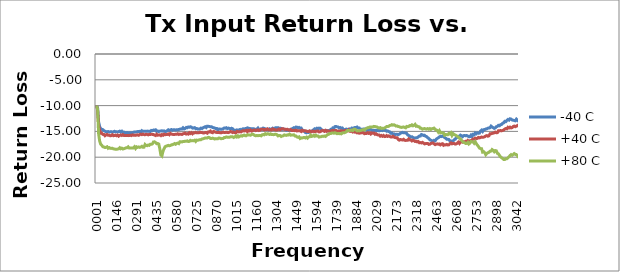
| Category | -40 C | +40 C | +80 C |
|---|---|---|---|
| 1000000.0 | -10 | -10 | -10 |
| 8622500.0 | -10.406 | -10.867 | -10.661 |
| 16245000.0 | -13.164 | -13.884 | -15.532 |
| 23867500.0 | -14.126 | -14.78 | -16.894 |
| 31490000.0 | -14.469 | -15.348 | -17.511 |
| 39112500.0 | -14.605 | -15.348 | -17.685 |
| 46735000.0 | -14.668 | -15.577 | -17.967 |
| 54357500.0 | -14.865 | -15.582 | -18.017 |
| 61980000.0 | -14.966 | -15.832 | -18.123 |
| 69602500.0 | -15.059 | -15.669 | -18.087 |
| 77225000.0 | -15.07 | -15.591 | -17.977 |
| 84847500.0 | -15.022 | -15.752 | -18.266 |
| 92470000.0 | -15.108 | -15.729 | -18.141 |
| 100092500.0 | -15.092 | -15.85 | -18.28 |
| 107715000.0 | -15.068 | -15.817 | -18.296 |
| 115337500.0 | -15.127 | -15.643 | -18.258 |
| 122960000.0 | -15.093 | -15.827 | -18.385 |
| 130582500.0 | -14.984 | -15.808 | -18.409 |
| 138205000.0 | -15.082 | -15.721 | -18.461 |
| 145827500.0 | -15.086 | -15.832 | -18.457 |
| 153450000.0 | -15.106 | -15.706 | -18.428 |
| 161072500.0 | -15.042 | -15.921 | -18.37 |
| 168695000.0 | -14.95 | -15.761 | -18.169 |
| 176317500.0 | -15.136 | -15.681 | -18.36 |
| 183940000.0 | -14.973 | -15.785 | -18.251 |
| 191562500.0 | -15.238 | -15.634 | -18.404 |
| 199185000.0 | -15.139 | -15.783 | -18.338 |
| 206807500.0 | -15.247 | -15.796 | -18.275 |
| 214430000.0 | -15.261 | -15.783 | -18.187 |
| 222052500.0 | -15.218 | -15.792 | -18.161 |
| 229675000.0 | -15.338 | -15.82 | -17.993 |
| 237297500.0 | -15.252 | -15.797 | -18.234 |
| 244920000.0 | -15.248 | -15.747 | -18.239 |
| 252542500.0 | -15.294 | -15.813 | -18.208 |
| 260165000.0 | -15.252 | -15.669 | -18.198 |
| 267787500.0 | -15.179 | -15.744 | -18.199 |
| 275410000.0 | -15.116 | -15.716 | -17.983 |
| 283032500.0 | -15.129 | -15.763 | -18.3 |
| 290655000.0 | -15.085 | -15.687 | -17.994 |
| 298277500.0 | -15.026 | -15.668 | -18.102 |
| 305900000.0 | -15.038 | -15.749 | -18.011 |
| 313522500.0 | -14.986 | -15.612 | -18.091 |
| 321145000.0 | -15.188 | -15.537 | -18.026 |
| 328767500.0 | -14.872 | -15.624 | -17.884 |
| 336390000.0 | -14.987 | -15.521 | -18.079 |
| 344012500.0 | -14.959 | -15.625 | -18.056 |
| 351635000.0 | -14.995 | -15.633 | -17.539 |
| 359257500.0 | -14.993 | -15.559 | -17.719 |
| 366880000.0 | -14.943 | -15.601 | -17.771 |
| 374502500.0 | -14.981 | -15.676 | -17.636 |
| 382125000.0 | -14.96 | -15.57 | -17.703 |
| 389747500.0 | -15.027 | -15.598 | -17.497 |
| 397370000.0 | -14.813 | -15.552 | -17.51 |
| 404992500.0 | -14.86 | -15.59 | -17.403 |
| 412615000.0 | -14.733 | -15.609 | -17.042 |
| 420237500.0 | -14.773 | -15.721 | -17.022 |
| 427860000.0 | -14.693 | -15.799 | -17.17 |
| 435482500.0 | -15.021 | -15.562 | -17.385 |
| 443105000.0 | -14.916 | -15.735 | -17.334 |
| 450727500.0 | -15.025 | -15.702 | -17.452 |
| 458350000.0 | -14.945 | -15.663 | -18.364 |
| 465972500.0 | -14.92 | -15.805 | -19.572 |
| 473595000.0 | -14.875 | -15.612 | -19.762 |
| 481217500.0 | -14.97 | -15.741 | -18.847 |
| 488840000.0 | -14.903 | -15.534 | -18.354 |
| 496462500.0 | -15.027 | -15.64 | -17.966 |
| 504085000.0 | -14.991 | -15.608 | -17.851 |
| 511707500.0 | -14.853 | -15.604 | -17.8 |
| 519330000.0 | -14.692 | -15.499 | -17.709 |
| 526952500.0 | -14.823 | -15.648 | -17.79 |
| 534575000.0 | -14.728 | -15.394 | -17.733 |
| 542197500.0 | -14.643 | -15.502 | -17.607 |
| 549820000.0 | -14.768 | -15.571 | -17.584 |
| 557442500.0 | -14.67 | -15.622 | -17.469 |
| 565065000.0 | -14.696 | -15.581 | -17.358 |
| 572687500.0 | -14.714 | -15.565 | -17.492 |
| 580310000.0 | -14.693 | -15.555 | -17.335 |
| 587932500.0 | -14.677 | -15.461 | -17.275 |
| 595555000.0 | -14.633 | -15.596 | -17.369 |
| 603177500.0 | -14.568 | -15.521 | -17.01 |
| 610800000.0 | -14.519 | -15.541 | -17.002 |
| 618422500.0 | -14.523 | -15.586 | -17.042 |
| 626045000.0 | -14.307 | -15.459 | -16.971 |
| 633667500.0 | -14.518 | -15.417 | -16.959 |
| 641290000.0 | -14.435 | -15.334 | -16.894 |
| 648912500.0 | -14.233 | -15.518 | -16.909 |
| 656535000.0 | -14.299 | -15.438 | -16.837 |
| 664157500.0 | -14.145 | -15.521 | -16.966 |
| 671780000.0 | -14.191 | -15.261 | -16.938 |
| 679402500.0 | -14.104 | -15.407 | -16.736 |
| 687025000.0 | -14.173 | -15.247 | -16.824 |
| 694647500.0 | -14.362 | -15.47 | -16.783 |
| 702270000.0 | -14.324 | -15.275 | -16.806 |
| 709892500.0 | -14.274 | -15.289 | -16.715 |
| 717515000.0 | -14.471 | -15.196 | -16.949 |
| 725137500.0 | -14.435 | -15.276 | -16.692 |
| 732760000.0 | -14.546 | -15.281 | -16.728 |
| 740382500.0 | -14.553 | -15.277 | -16.645 |
| 748005000.0 | -14.521 | -15.156 | -16.631 |
| 755627500.0 | -14.358 | -15.214 | -16.605 |
| 763250000.0 | -14.448 | -15.216 | -16.471 |
| 770872500.0 | -14.292 | -15.295 | -16.439 |
| 778495000.0 | -14.209 | -15.297 | -16.366 |
| 786117500.0 | -14.091 | -15.222 | -16.283 |
| 793740000.0 | -14.25 | -15.206 | -16.269 |
| 801362500.0 | -13.992 | -15.333 | -16.277 |
| 808985000.0 | -14.018 | -15.09 | -16.154 |
| 816607500.0 | -14.057 | -15.109 | -16.197 |
| 824230000.0 | -14.107 | -14.939 | -16.37 |
| 831852500.0 | -14.086 | -15.197 | -16.392 |
| 839475000.0 | -14.239 | -15.256 | -16.306 |
| 847097500.0 | -14.272 | -15.007 | -16.368 |
| 854720000.0 | -14.345 | -15.074 | -16.473 |
| 862342500.0 | -14.445 | -15.175 | -16.403 |
| 869965000.0 | -14.429 | -15.198 | -16.446 |
| 877587500.0 | -14.728 | -15.218 | -16.429 |
| 885210000.0 | -14.552 | -15.17 | -16.273 |
| 892832500.0 | -14.535 | -15.258 | -16.315 |
| 900455000.0 | -14.596 | -15.27 | -16.411 |
| 908077500.0 | -14.551 | -15.223 | -16.393 |
| 915700000.0 | -14.505 | -15.148 | -16.379 |
| 923322500.0 | -14.337 | -15.209 | -16.202 |
| 930945000.0 | -14.369 | -15.198 | -16.205 |
| 938567500.0 | -14.29 | -15.173 | -16.07 |
| 946190000.0 | -14.463 | -15.215 | -16.116 |
| 953812500.0 | -14.355 | -15.236 | -16.135 |
| 961435000.0 | -14.416 | -15.136 | -16.138 |
| 969057500.0 | -14.551 | -15.038 | -16.055 |
| 976680000.0 | -14.399 | -15.054 | -16.056 |
| 984302500.0 | -14.48 | -15.221 | -16.035 |
| 991925000.0 | -14.701 | -15.129 | -16.186 |
| 999547500.0 | -14.782 | -15.241 | -16.089 |
| 1007170000.0 | -14.815 | -15.285 | -15.894 |
| 1014792500.0 | -14.705 | -15.012 | -16.082 |
| 1022415000.0 | -14.813 | -15.049 | -15.856 |
| 1030037500.0 | -14.714 | -15.101 | -16.058 |
| 1037660000.0 | -14.625 | -15.055 | -15.919 |
| 1045282500.0 | -14.807 | -15.095 | -15.833 |
| 1052905000.0 | -14.59 | -14.942 | -15.92 |
| 1060527500.0 | -14.491 | -14.874 | -15.774 |
| 1068150000.0 | -14.528 | -14.918 | -15.703 |
| 1075772500.0 | -14.46 | -14.873 | -15.829 |
| 1083395000.0 | -14.462 | -14.806 | -15.834 |
| 1091017500.0 | -14.315 | -15.053 | -15.655 |
| 1098640000.0 | -14.379 | -14.795 | -15.673 |
| 1106262500.0 | -14.438 | -14.883 | -15.707 |
| 1113885000.0 | -14.466 | -14.721 | -15.739 |
| 1121507500.0 | -14.475 | -14.937 | -15.595 |
| 1129130000.0 | -14.51 | -14.856 | -15.539 |
| 1136752500.0 | -14.485 | -14.759 | -15.639 |
| 1144375000.0 | -14.719 | -14.737 | -15.787 |
| 1151997500.0 | -14.596 | -14.852 | -15.847 |
| 1159620000.0 | -14.561 | -14.786 | -15.781 |
| 1167242500.0 | -14.355 | -14.703 | -15.829 |
| 1174865000.0 | -14.648 | -14.831 | -15.798 |
| 1182487500.0 | -14.583 | -14.734 | -15.794 |
| 1190110000.0 | -14.513 | -14.588 | -15.86 |
| 1197732500.0 | -14.57 | -14.586 | -15.657 |
| 1205355000.0 | -14.363 | -14.598 | -15.613 |
| 1212977500.0 | -14.434 | -14.695 | -15.664 |
| 1220600000.0 | -14.53 | -14.602 | -15.449 |
| 1228222500.0 | -14.57 | -14.648 | -15.567 |
| 1235845000.0 | -14.599 | -14.509 | -15.478 |
| 1243467500.0 | -14.698 | -14.667 | -15.48 |
| 1251090000.0 | -14.505 | -14.692 | -15.584 |
| 1258712500.0 | -14.613 | -14.647 | -15.481 |
| 1266335000.0 | -14.531 | -14.712 | -15.618 |
| 1273957500.0 | -14.376 | -14.516 | -15.619 |
| 1281580000.0 | -14.515 | -14.621 | -15.632 |
| 1289202500.0 | -14.369 | -14.651 | -15.569 |
| 1296825000.0 | -14.278 | -14.733 | -15.562 |
| 1304447500.0 | -14.286 | -14.727 | -15.638 |
| 1312070000.0 | -14.272 | -14.651 | -15.866 |
| 1319692500.0 | -14.481 | -14.549 | -15.809 |
| 1327315000.0 | -14.369 | -14.68 | -15.811 |
| 1334937500.0 | -14.42 | -14.557 | -15.98 |
| 1342560000.0 | -14.611 | -14.462 | -15.879 |
| 1350182500.0 | -14.506 | -14.498 | -15.849 |
| 1357805000.0 | -14.601 | -14.603 | -15.68 |
| 1365427500.0 | -14.62 | -14.576 | -15.742 |
| 1373050000.0 | -14.771 | -14.62 | -15.77 |
| 1380672500.0 | -14.688 | -14.59 | -15.672 |
| 1388295000.0 | -14.795 | -14.712 | -15.69 |
| 1395917500.0 | -14.7 | -14.733 | -15.537 |
| 1403540000.0 | -14.761 | -14.63 | -15.727 |
| 1411162500.0 | -14.512 | -14.825 | -15.718 |
| 1418785000.0 | -14.443 | -14.823 | -15.701 |
| 1426407500.0 | -14.29 | -14.785 | -15.656 |
| 1434030000.0 | -14.353 | -14.859 | -15.877 |
| 1441652500.0 | -14.153 | -14.763 | -15.88 |
| 1449275000.0 | -14.193 | -14.917 | -16.075 |
| 1456897500.0 | -14.342 | -14.85 | -16.147 |
| 1464520000.0 | -14.226 | -14.87 | -16.059 |
| 1472142500.0 | -14.383 | -14.887 | -16.374 |
| 1479765000.0 | -14.355 | -15.021 | -16.25 |
| 1487387500.0 | -14.684 | -14.797 | -16.279 |
| 1495010000.0 | -14.892 | -14.934 | -16.2 |
| 1502632500.0 | -14.925 | -14.864 | -16.176 |
| 1510255000.0 | -15.22 | -14.888 | -16.271 |
| 1517877500.0 | -15.288 | -14.921 | -16.114 |
| 1525500000.0 | -15.183 | -15.023 | -16.306 |
| 1533122500.0 | -15.196 | -14.996 | -16.084 |
| 1540745000.0 | -15.106 | -14.9 | -16.044 |
| 1548367500.0 | -15.032 | -15.128 | -15.735 |
| 1555990000.0 | -14.924 | -15.076 | -15.97 |
| 1563612500.0 | -14.812 | -14.94 | -15.929 |
| 1571235000.0 | -14.64 | -15.018 | -15.744 |
| 1578857500.0 | -14.484 | -15.06 | -15.925 |
| 1586480000.0 | -14.578 | -14.966 | -15.729 |
| 1594102500.0 | -14.397 | -14.961 | -15.91 |
| 1601725000.0 | -14.521 | -14.925 | -15.911 |
| 1609347500.0 | -14.363 | -15.101 | -16.095 |
| 1616970000.0 | -14.393 | -15.065 | -16.025 |
| 1624592500.0 | -14.607 | -14.945 | -16.021 |
| 1632215000.0 | -14.767 | -14.833 | -15.932 |
| 1639837500.0 | -14.82 | -14.854 | -15.962 |
| 1647460000.0 | -14.909 | -14.985 | -15.887 |
| 1655082500.0 | -14.849 | -14.802 | -15.981 |
| 1662705000.0 | -14.808 | -14.981 | -15.785 |
| 1670327500.0 | -14.9 | -14.89 | -15.618 |
| 1677950000.0 | -14.846 | -14.916 | -15.578 |
| 1685572500.0 | -14.901 | -15.019 | -15.405 |
| 1693195000.0 | -14.623 | -14.899 | -15.423 |
| 1700817500.0 | -14.685 | -14.894 | -15.326 |
| 1708440000.0 | -14.327 | -14.819 | -15.313 |
| 1716062500.0 | -14.386 | -14.958 | -15.355 |
| 1723685000.0 | -14.071 | -14.819 | -15.258 |
| 1731307500.0 | -14.045 | -14.818 | -15.344 |
| 1738930000.0 | -14.119 | -14.981 | -15.449 |
| 1746552500.0 | -14.142 | -14.923 | -15.386 |
| 1754175000.0 | -14.329 | -14.92 | -15.439 |
| 1761797500.0 | -14.247 | -14.89 | -15.421 |
| 1769420000.0 | -14.405 | -14.886 | -15.482 |
| 1777042500.0 | -14.341 | -14.911 | -15.287 |
| 1784665000.0 | -14.598 | -14.91 | -15.284 |
| 1792287500.0 | -14.726 | -14.932 | -15.26 |
| 1799910000.0 | -14.599 | -14.817 | -15.175 |
| 1807532500.0 | -14.556 | -14.909 | -15.024 |
| 1815155000.0 | -14.675 | -14.899 | -14.828 |
| 1822777500.0 | -14.571 | -14.709 | -14.843 |
| 1830400000.0 | -14.514 | -14.973 | -14.859 |
| 1838022500.0 | -14.592 | -14.998 | -14.787 |
| 1845645000.0 | -14.354 | -14.828 | -14.747 |
| 1853267500.0 | -14.382 | -15.111 | -14.843 |
| 1860890000.0 | -14.327 | -15.04 | -14.581 |
| 1868512500.0 | -14.239 | -15.154 | -14.596 |
| 1876135000.0 | -14.262 | -15.107 | -14.715 |
| 1883757500.0 | -14.153 | -15.285 | -14.908 |
| 1891380000.0 | -14.336 | -15.208 | -14.875 |
| 1899002500.0 | -14.334 | -15.35 | -14.9 |
| 1906625000.0 | -14.714 | -15.319 | -14.819 |
| 1914247500.0 | -14.584 | -15.272 | -14.788 |
| 1921870000.0 | -14.618 | -15.232 | -14.715 |
| 1929492500.0 | -14.525 | -15.284 | -14.647 |
| 1937115000.0 | -14.547 | -15.443 | -14.714 |
| 1944737500.0 | -14.568 | -15.396 | -14.526 |
| 1952360000.0 | -14.72 | -15.416 | -14.375 |
| 1959982500.0 | -14.483 | -15.254 | -14.292 |
| 1967605000.0 | -14.685 | -15.378 | -14.27 |
| 1975227500.0 | -14.532 | -15.288 | -14.15 |
| 1982850000.0 | -14.626 | -15.505 | -14.179 |
| 1990472500.0 | -14.769 | -15.3 | -14.142 |
| 1998095000.0 | -14.907 | -15.342 | -14.125 |
| 2005717500.0 | -14.773 | -15.319 | -14.029 |
| 2013340000.0 | -14.881 | -15.561 | -14.061 |
| 2020962500.0 | -14.773 | -15.45 | -14.108 |
| 2028585000.0 | -14.853 | -15.634 | -14.147 |
| 2036207500.0 | -14.708 | -15.703 | -14.311 |
| 2043830000.0 | -14.896 | -15.697 | -14.347 |
| 2051452500.0 | -14.845 | -15.921 | -14.269 |
| 2059075000.0 | -14.736 | -15.791 | -14.425 |
| 2066697500.0 | -14.829 | -15.941 | -14.402 |
| 2074320000.0 | -14.668 | -15.787 | -14.403 |
| 2081942500.0 | -14.775 | -16.002 | -14.342 |
| 2089565000.0 | -14.801 | -15.974 | -14.213 |
| 2097187500.0 | -14.965 | -15.805 | -14.069 |
| 2104810000.0 | -14.91 | -15.971 | -14.073 |
| 2112432500.0 | -15.038 | -15.874 | -14.009 |
| 2120055000.0 | -15.09 | -15.989 | -13.855 |
| 2127677500.0 | -15.362 | -16.091 | -13.819 |
| 2135300000.0 | -15.333 | -16.086 | -13.695 |
| 2142922500.0 | -15.53 | -15.948 | -13.786 |
| 2150545000.0 | -15.48 | -16.11 | -13.725 |
| 2158167500.0 | -15.642 | -16.194 | -13.828 |
| 2165790000.0 | -15.546 | -16.224 | -13.975 |
| 2173412500.0 | -15.557 | -16.221 | -13.942 |
| 2181035000.0 | -15.623 | -16.553 | -14.058 |
| 2188657500.0 | -15.535 | -16.693 | -14.086 |
| 2196280000.0 | -15.375 | -16.576 | -14.198 |
| 2203902500.0 | -15.282 | -16.629 | -14.226 |
| 2211525000.0 | -15.194 | -16.66 | -14.195 |
| 2219147500.0 | -15.272 | -16.533 | -14.132 |
| 2226770000.0 | -15.265 | -16.718 | -14.226 |
| 2234392500.0 | -15.301 | -16.744 | -14.311 |
| 2242015000.0 | -15.383 | -16.737 | -14.039 |
| 2249637500.0 | -15.701 | -16.732 | -14.089 |
| 2257260000.0 | -15.778 | -16.457 | -14.038 |
| 2264882500.0 | -15.949 | -16.647 | -13.862 |
| 2272505000.0 | -16.118 | -16.669 | -13.905 |
| 2280127500.0 | -16.038 | -16.844 | -13.734 |
| 2287750000.0 | -16.17 | -16.71 | -13.922 |
| 2295372500.0 | -16.279 | -16.811 | -13.826 |
| 2302995000.0 | -16.278 | -16.959 | -13.644 |
| 2310617500.0 | -16.234 | -16.914 | -14.009 |
| 2318240000.0 | -16.225 | -17.037 | -13.975 |
| 2325862500.0 | -16.058 | -16.953 | -14.093 |
| 2333485000.0 | -15.909 | -17.19 | -14.123 |
| 2341107500.0 | -15.893 | -17.169 | -14.4 |
| 2348730000.0 | -15.607 | -17.241 | -14.407 |
| 2356352500.0 | -15.672 | -17.125 | -14.572 |
| 2363975000.0 | -15.789 | -17.255 | -14.497 |
| 2371597500.0 | -15.741 | -17.42 | -14.447 |
| 2379220000.0 | -15.948 | -17.362 | -14.542 |
| 2386842500.0 | -16.015 | -17.364 | -14.564 |
| 2394465000.0 | -16.227 | -17.345 | -14.459 |
| 2402087500.0 | -16.376 | -17.518 | -14.577 |
| 2409710000.0 | -16.631 | -17.48 | -14.456 |
| 2417332500.0 | -16.71 | -17.323 | -14.618 |
| 2424955000.0 | -16.805 | -17.274 | -14.487 |
| 2432577500.0 | -16.983 | -17.252 | -14.424 |
| 2440200000.0 | -16.74 | -17.413 | -14.365 |
| 2447822500.0 | -16.82 | -17.562 | -14.61 |
| 2455445000.0 | -16.543 | -17.485 | -14.706 |
| 2463067500.0 | -16.354 | -17.416 | -14.815 |
| 2470690000.0 | -16.243 | -17.487 | -15.138 |
| 2478312500.0 | -16.07 | -17.435 | -14.857 |
| 2485935000.0 | -15.947 | -17.612 | -15.277 |
| 2493557500.0 | -16.005 | -17.451 | -15.237 |
| 2501180000.0 | -15.901 | -17.393 | -15.266 |
| 2508802500.0 | -16.025 | -17.688 | -15.336 |
| 2516425000.0 | -16.189 | -17.589 | -15.734 |
| 2524047500.0 | -16.332 | -17.614 | -15.617 |
| 2531670000.0 | -16.525 | -17.534 | -15.627 |
| 2539292500.0 | -16.519 | -17.635 | -15.644 |
| 2546915000.0 | -16.567 | -17.599 | -15.397 |
| 2554537500.0 | -16.842 | -17.385 | -15.5 |
| 2562160000.0 | -16.843 | -17.24 | -15.287 |
| 2569782500.0 | -16.976 | -17.416 | -15.771 |
| 2577405000.0 | -16.852 | -17.321 | -15.428 |
| 2585027500.0 | -16.627 | -17.333 | -15.594 |
| 2592650000.0 | -16.523 | -17.461 | -15.691 |
| 2600272500.0 | -16.241 | -17.422 | -15.825 |
| 2607895000.0 | -16.133 | -17.301 | -15.967 |
| 2615517500.0 | -15.961 | -17.093 | -16.092 |
| 2623140000.0 | -15.963 | -17.33 | -16.336 |
| 2630762500.0 | -15.728 | -17.027 | -16.447 |
| 2638385000.0 | -15.855 | -17.024 | -16.709 |
| 2646007500.0 | -16.026 | -17.093 | -16.957 |
| 2653630000.0 | -15.82 | -17.011 | -17.122 |
| 2661252500.0 | -15.787 | -17.035 | -17.201 |
| 2668875000.0 | -15.84 | -16.923 | -17.34 |
| 2676497500.0 | -15.797 | -17.139 | -17.312 |
| 2684120000.0 | -15.899 | -16.773 | -17.114 |
| 2691742500.0 | -16.041 | -16.913 | -17.44 |
| 2699365000.0 | -16.017 | -16.82 | -17.24 |
| 2706987500.0 | -15.73 | -16.791 | -16.96 |
| 2714610000.0 | -16.003 | -16.664 | -17.003 |
| 2722232500.0 | -15.572 | -16.467 | -17.045 |
| 2729855000.0 | -15.648 | -16.486 | -17.3 |
| 2737477500.0 | -15.313 | -16.305 | -17.008 |
| 2745100000.0 | -15.469 | -16.409 | -17.36 |
| 2752722500.0 | -15.275 | -16.358 | -17.661 |
| 2760345000.0 | -15.35 | -16.167 | -17.897 |
| 2767967500.0 | -15.326 | -16.254 | -18.234 |
| 2775590000.0 | -14.941 | -16.182 | -18.329 |
| 2783212500.0 | -14.766 | -16.094 | -18.344 |
| 2790835000.0 | -15.008 | -16.145 | -19.009 |
| 2798457500.0 | -14.66 | -16.109 | -18.93 |
| 2806080000.0 | -14.646 | -16.039 | -19.133 |
| 2813702500.0 | -14.527 | -15.879 | -19.515 |
| 2821325000.0 | -14.514 | -15.813 | -19.27 |
| 2828947500.0 | -14.368 | -15.931 | -19.128 |
| 2836570000.0 | -14.348 | -15.851 | -19.062 |
| 2844192500.0 | -14.289 | -15.473 | -18.847 |
| 2851815000.0 | -13.977 | -15.469 | -18.82 |
| 2859437500.0 | -14.159 | -15.388 | -18.523 |
| 2867060000.0 | -14.271 | -15.347 | -18.683 |
| 2874682500.0 | -14.408 | -15.274 | -18.935 |
| 2882305000.0 | -14.329 | -15.141 | -18.716 |
| 2889927500.0 | -14.087 | -15.25 | -18.764 |
| 2897550000.0 | -14.037 | -15.237 | -19.249 |
| 2905172500.0 | -13.835 | -14.881 | -19.346 |
| 2912795000.0 | -13.899 | -14.905 | -19.672 |
| 2920417500.0 | -13.693 | -14.831 | -19.93 |
| 2928040000.0 | -13.658 | -14.887 | -20.095 |
| 2935662500.0 | -13.416 | -14.811 | -20.25 |
| 2943285000.0 | -13.331 | -14.724 | -20.444 |
| 2950907500.0 | -13.057 | -14.555 | -20.445 |
| 2958530000.0 | -13.111 | -14.436 | -20.297 |
| 2966152500.0 | -12.88 | -14.492 | -20.296 |
| 2973775000.0 | -12.69 | -14.207 | -20.117 |
| 2981397500.0 | -12.816 | -14.336 | -19.937 |
| 2989020000.0 | -12.556 | -14.176 | -19.681 |
| 2996642500.0 | -12.613 | -14.328 | -19.494 |
| 3004265000.0 | -12.783 | -14.264 | -19.633 |
| 3011887500.0 | -12.836 | -14.046 | -19.47 |
| 3019510000.0 | -12.884 | -13.969 | -19.295 |
| 3027132500.0 | -12.939 | -14.092 | -19.455 |
| 3034755000.0 | -12.638 | -13.967 | -19.483 |
| 3042377500.0 | -12.848 | -13.911 | -19.676 |
| 3050000000.0 | -12.571 | -13.663 | -20.113 |